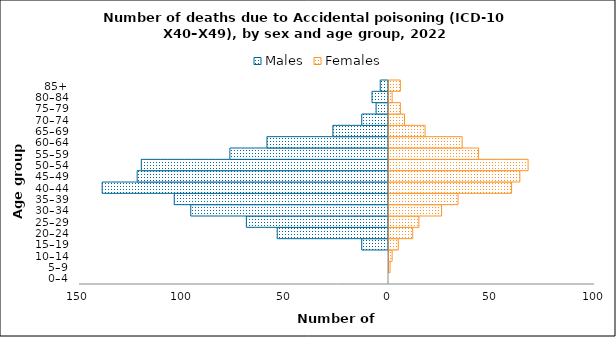
| Category | Males | Females |
|---|---|---|
| 0–4 | 0 | 0 |
| 5–9 | 0 | 1 |
| 10–14 | 0 | 2 |
| 15–19 | -13 | 5 |
| 20–24 | -54 | 12 |
| 25–29 | -69 | 15 |
| 30–34 | -96 | 26 |
| 35–39 | -104 | 34 |
| 40–44 | -139 | 60 |
| 45–49 | -122 | 64 |
| 50–54 | -120 | 68 |
| 55–59 | -77 | 44 |
| 60–64 | -59 | 36 |
| 65–69 | -27 | 18 |
| 70–74 | -13 | 8 |
| 75–79 | -6 | 6 |
| 80–84 | -8 | 2 |
| 85+ | -4 | 6 |